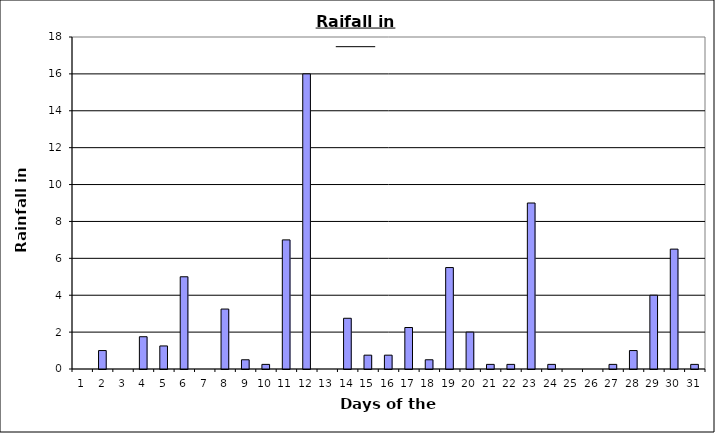
| Category | Series 0 |
|---|---|
| 0 | 0 |
| 1 | 1 |
| 2 | 0 |
| 3 | 1.75 |
| 4 | 1.25 |
| 5 | 5 |
| 6 | 0 |
| 7 | 3.25 |
| 8 | 0.5 |
| 9 | 0.25 |
| 10 | 7 |
| 11 | 16 |
| 12 | 0 |
| 13 | 2.75 |
| 14 | 0.75 |
| 15 | 0.75 |
| 16 | 2.25 |
| 17 | 0.5 |
| 18 | 5.5 |
| 19 | 2 |
| 20 | 0.25 |
| 21 | 0.25 |
| 22 | 9 |
| 23 | 0.25 |
| 24 | 0 |
| 25 | 0 |
| 26 | 0.25 |
| 27 | 1 |
| 28 | 4 |
| 29 | 6.5 |
| 30 | 0.25 |